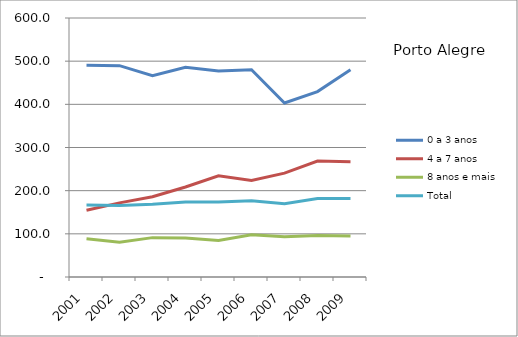
| Category | 0 a 3 anos | 4 a 7 anos | 8 anos e mais | Total |
|---|---|---|---|---|
| 2001.0 | 490.6 | 154.6 | 88.7 | 166.7 |
| 2002.0 | 489.6 | 171.7 | 80.4 | 165.7 |
| 2003.0 | 466.6 | 185.9 | 91.2 | 168.5 |
| 2004.0 | 485.9 | 208.6 | 90.3 | 173.5 |
| 2005.0 | 477.4 | 234.4 | 84.5 | 173.8 |
| 2006.0 | 480.3 | 223.6 | 98.1 | 176.7 |
| 2007.0 | 403.1 | 240.7 | 93.1 | 169.7 |
| 2008.0 | 429.5 | 268.5 | 96.2 | 181.8 |
| 2009.0 | 479.9 | 267.2 | 95.1 | 181.6 |